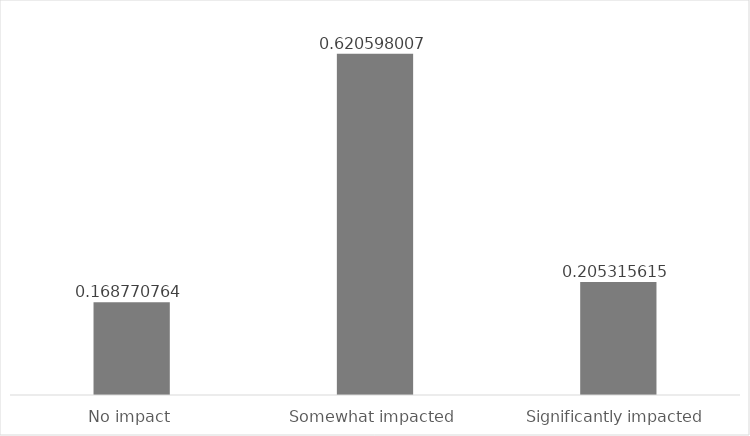
| Category | Series 0 |
|---|---|
| No impact | 0.169 |
| Somewhat impacted | 0.621 |
| Significantly impacted | 0.205 |